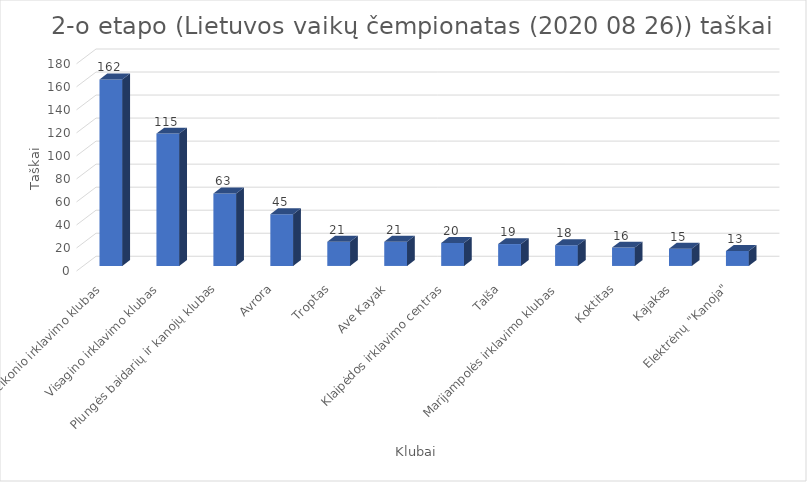
| Category | Series 0 |
|---|---|
| V. Vaičikonio irklavimo klubas | 162 |
| Visagino irklavimo klubas | 115 |
| Plungės baidarių ir kanojų klubas | 63 |
| Avrora | 45 |
| Troptas | 21 |
| Ave Kayak | 21 |
| Klaipėdos irklavimo centras | 20 |
| Talša | 19 |
| Marijampolės irklavimo klubas | 18 |
| Koktitas | 16 |
| Kajakas | 15 |
| Elektrėnų "Kanoja" | 13 |